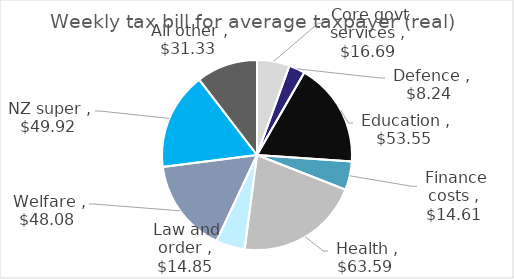
| Category | Series 0 |
|---|---|
|  Core govt services  | 16.693 |
|  Defence  | 8.245 |
|  Education  | 53.547 |
|  Finance costs  | 14.61 |
|  Health  | 63.591 |
|  Law and order  | 14.846 |
|  Welfare  | 48.078 |
|  NZ super  | 49.921 |
|  All other  | 31.328 |